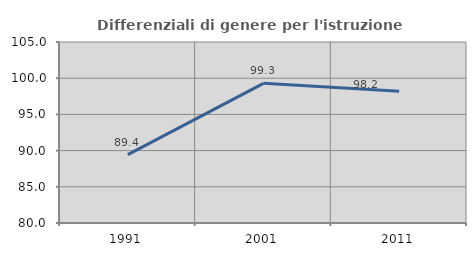
| Category | Differenziali di genere per l'istruzione superiore |
|---|---|
| 1991.0 | 89.449 |
| 2001.0 | 99.29 |
| 2011.0 | 98.197 |